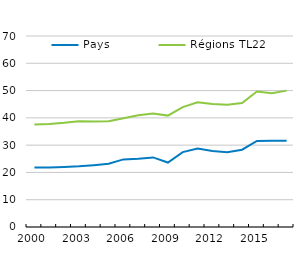
| Category | Pays | Régions TL22 |
|---|---|---|
| 2000.0 | 21.775 | 37.592 |
| 2001.0 | 21.792 | 37.791 |
| 2002.0 | 22.018 | 38.171 |
| 2003.0 | 22.25 | 38.719 |
| 2004.0 | 22.675 | 38.7 |
| 2005.0 | 23.155 | 38.771 |
| 2006.0 | 24.775 | 39.865 |
| 2007.0 | 24.978 | 40.925 |
| 2008.0 | 25.502 | 41.597 |
| 2009.0 | 23.629 | 40.825 |
| 2010.0 | 27.445 | 43.932 |
| 2011.0 | 28.73 | 45.746 |
| 2012.0 | 27.861 | 45.037 |
| 2013.0 | 27.371 | 44.799 |
| 2014.0 | 28.34 | 45.41 |
| 2015.0 | 31.544 | 49.653 |
| 2016.0 | 31.627 | 49.036 |
| 2017.0 | 31.635 | 49.98 |